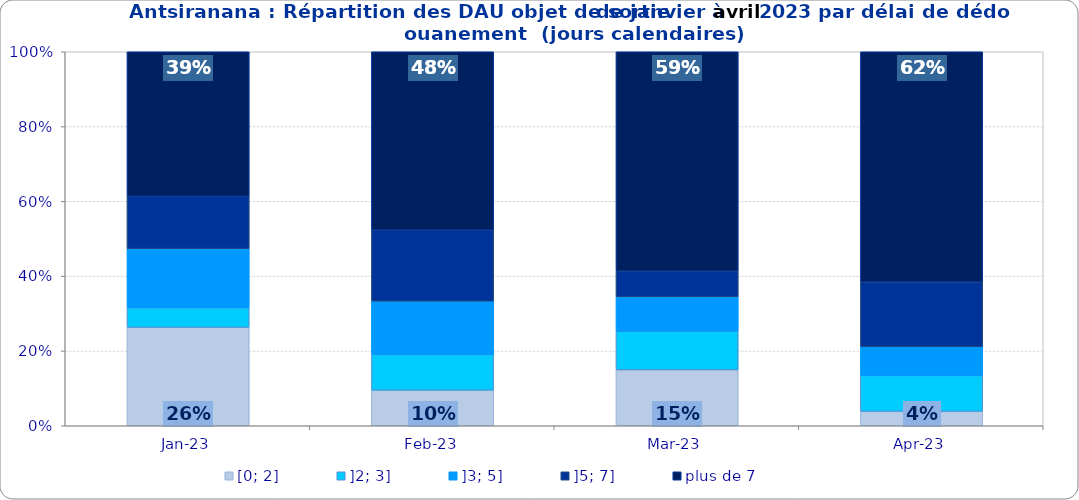
| Category | [0; 2] | ]2; 3] | ]3; 5] | ]5; 7] | plus de 7 |
|---|---|---|---|---|---|
| 2023-01-01 | 0.263 | 0.053 | 0.158 | 0.14 | 0.386 |
| 2023-02-01 | 0.095 | 0.095 | 0.143 | 0.19 | 0.476 |
| 2023-03-01 | 0.149 | 0.103 | 0.092 | 0.069 | 0.586 |
| 2023-04-01 | 0.038 | 0.096 | 0.077 | 0.173 | 0.615 |